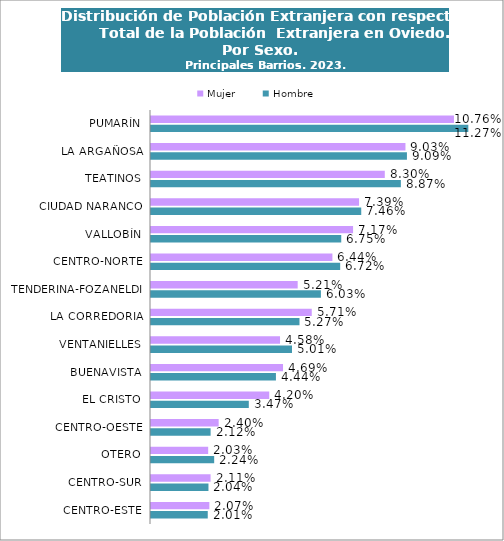
| Category | Hombre | Mujer |
|---|---|---|
| CENTRO-ESTE | 0.02 | 0.021 |
| CENTRO-SUR | 0.02 | 0.021 |
| OTERO | 0.022 | 0.02 |
| CENTRO-OESTE | 0.021 | 0.024 |
| EL CRISTO | 0.035 | 0.042 |
| BUENAVISTA | 0.044 | 0.047 |
| VENTANIELLES | 0.05 | 0.046 |
| LA CORREDORIA | 0.053 | 0.057 |
| TENDERINA-FOZANELDI | 0.06 | 0.052 |
| CENTRO-NORTE | 0.067 | 0.064 |
| VALLOBÍN | 0.068 | 0.072 |
| CIUDAD NARANCO | 0.075 | 0.074 |
| TEATINOS | 0.089 | 0.083 |
| LA ARGAÑOSA | 0.091 | 0.09 |
| PUMARÍN | 0.113 | 0.108 |